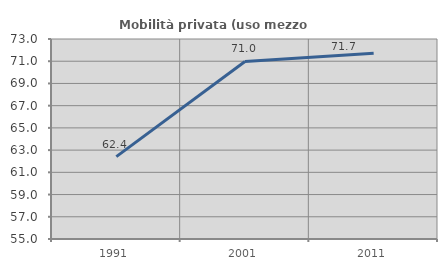
| Category | Mobilità privata (uso mezzo privato) |
|---|---|
| 1991.0 | 62.418 |
| 2001.0 | 70.98 |
| 2011.0 | 71.725 |